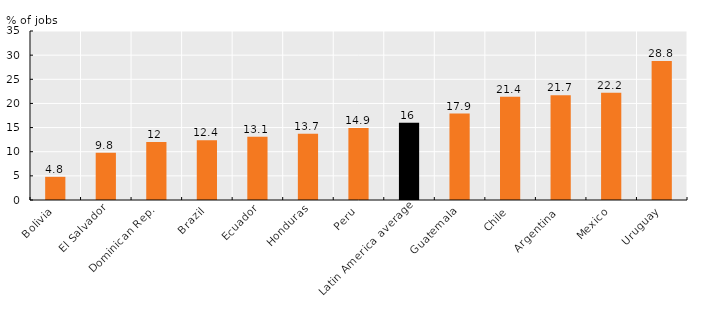
| Category | Series 0 |
|---|---|
| Bolivia | 4.8 |
| El Salvador | 9.8 |
| Dominican Rep. | 12 |
| Brazil | 12.4 |
| Ecuador | 13.1 |
| Honduras | 13.7 |
| Peru | 14.9 |
| Latin America average | 16 |
| Guatemala | 17.9 |
| Chile | 21.4 |
| Argentina  | 21.7 |
| Mexico | 22.2 |
| Uruguay | 28.8 |